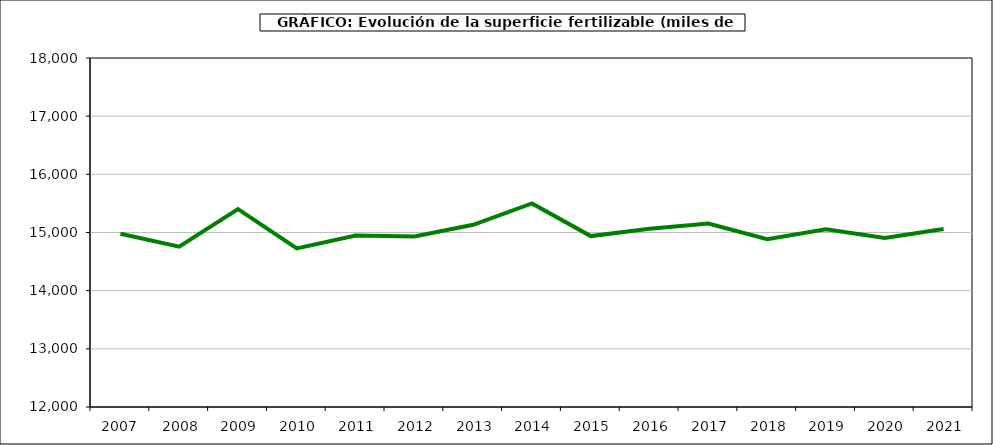
| Category | fertilizantes |
|---|---|
|   2007  | 14979.076 |
|   2008 | 14757 |
|   2009 | 15402 |
|   2010 | 14727 |
|   2011 | 14947 |
|   2012 | 14932 |
|   2013 | 15133 |
|   2014 | 15499 |
|   2015 | 14938 |
|   2016 | 15065 |
|   2017 | 15153 |
|   2018 | 14883 |
|   2019 | 15055 |
|   2020 | 14906 |
|   2021 | 15060.96 |